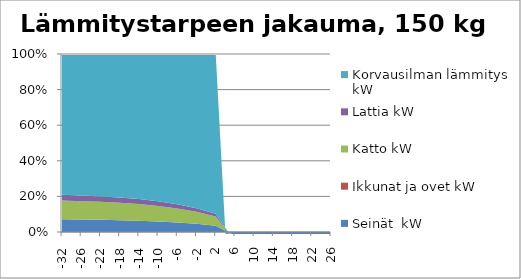
| Category | Seinät  kW | Ikkunat ja ovet kW | Katto kW | Lattia kW | Korvausilman lämmitys kW |
|---|---|---|---|---|---|
| -32.0 | 7.392 | 0 | 10.92 | 3.276 | 81.759 |
| -26.0 | 6.125 | 0 | 9.048 | 2.714 | 69.632 |
| -22.0 | 5.28 | 0 | 7.8 | 2.34 | 61.749 |
| -18.0 | 4.435 | 0 | 6.552 | 1.966 | 53.989 |
| -14.0 | 3.59 | 0 | 5.304 | 1.591 | 46.264 |
| -10.0 | 2.746 | 0 | 4.056 | 1.217 | 38.388 |
| -6.0 | 1.901 | 0 | 2.808 | 0.842 | 29.951 |
| -2.0 | 1.056 | 0 | 1.56 | 0.468 | 19.966 |
| 2.0 | 0.211 | 0 | 0.312 | 0.094 | 5.394 |
| 6.0 | -0.634 | 0 | -0.936 | -0.281 | -29.522 |
| 10.0 | -1.478 | 0 | -2.184 | -0.655 | -11.107 |
| 14.0 | -2.323 | 0 | -3.432 | -1.03 | -17.454 |
| 18.0 | -3.168 | 0 | -4.68 | -1.404 | -23.801 |
| 22.0 | -4.013 | 0 | -5.928 | -1.778 | -30.148 |
| 26.0 | -4.858 | 0 | -7.176 | -2.153 | -36.494 |